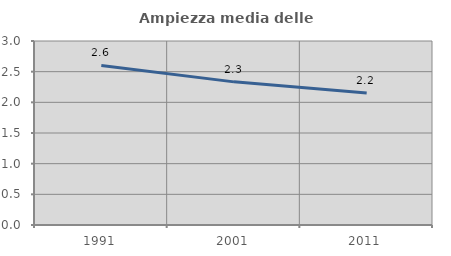
| Category | Ampiezza media delle famiglie |
|---|---|
| 1991.0 | 2.601 |
| 2001.0 | 2.334 |
| 2011.0 | 2.152 |